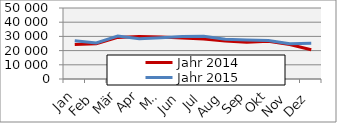
| Category | Jahr 2014 | Jahr 2015 |
|---|---|---|
| 0 | 24347.087 | 26859.592 |
| 1 | 24849.67 | 25336.981 |
| 2 | 29302.785 | 30224.453 |
| 3 | 29995.302 | 28415.025 |
| 4 | 29580.6 | 29067.19 |
| 5 | 28799.092 | 29853.123 |
| 6 | 28173.583 | 30154.946 |
| 7 | 26797.092 | 27996.932 |
| 8 | 25914.59 | 27419.206 |
| 9 | 26523.206 | 27092.821 |
| 10 | 24323.41 | 24837.733 |
| 11 | 20626.948 | 25106.366 |